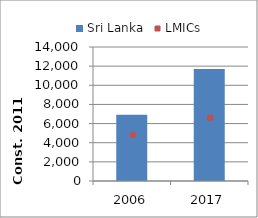
| Category | Sri Lanka |
|---|---|
| 2006.0 | 6921.246 |
| 2017.0 | 11691.285 |